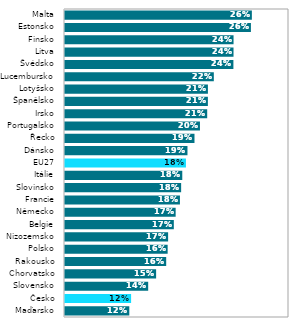
| Category | Series 0 |
|---|---|
| Maďarsko | 0.122 |
| Česko | 0.124 |
| Slovensko | 0.143 |
| Chorvatsko | 0.152 |
| Rakousko | 0.163 |
| Polsko | 0.165 |
| Nizozemsko | 0.165 |
| Belgie | 0.171 |
| Německo | 0.173 |
| Francie | 0.178 |
| Slovinsko | 0.18 |
| Itálie | 0.181 |
| EU27 | 0.185 |
| Dánsko | 0.187 |
| Řecko | 0.195 |
| Portugalsko | 0.201 |
| Irsko | 0.209 |
| Španělsko | 0.209 |
| Lotyšsko | 0.209 |
| Lucembursko | 0.216 |
| Švédsko | 0.238 |
| Litva | 0.238 |
| Finsko | 0.238 |
| Estonsko | 0.257 |
| Malta | 0.259 |